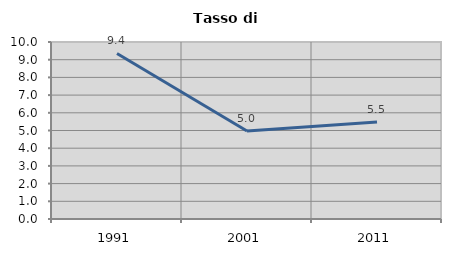
| Category | Tasso di disoccupazione   |
|---|---|
| 1991.0 | 9.353 |
| 2001.0 | 4.968 |
| 2011.0 | 5.479 |